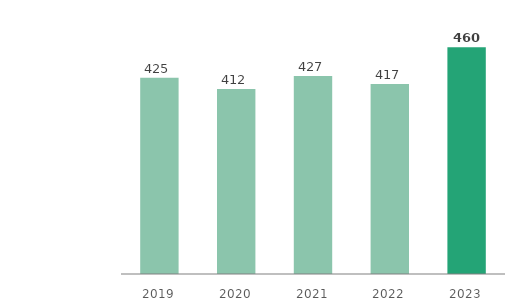
| Category | Assets in Kazakhstan |
|---|---|
| 2019.0 | 424.814 |
| 2020.0 | 411.9 |
| 2021.0 | 426.842 |
| 2022.0 | 417.459 |
| 2023.0 | 459.722 |